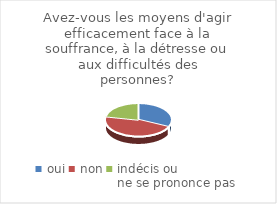
| Category | Avez-vous les moyens d'agir efficacement face à la souffrance, à la détresse ou aux difficultés des personnes? |
|---|---|
| oui | 25 |
| non | 36 |
| indécis ou 
ne se prononce pas | 17 |